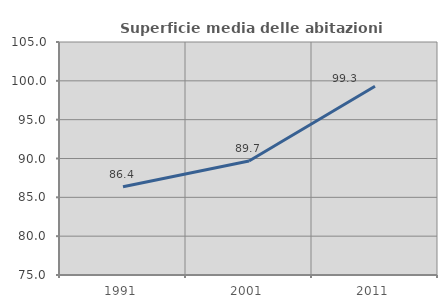
| Category | Superficie media delle abitazioni occupate |
|---|---|
| 1991.0 | 86.361 |
| 2001.0 | 89.683 |
| 2011.0 | 99.301 |